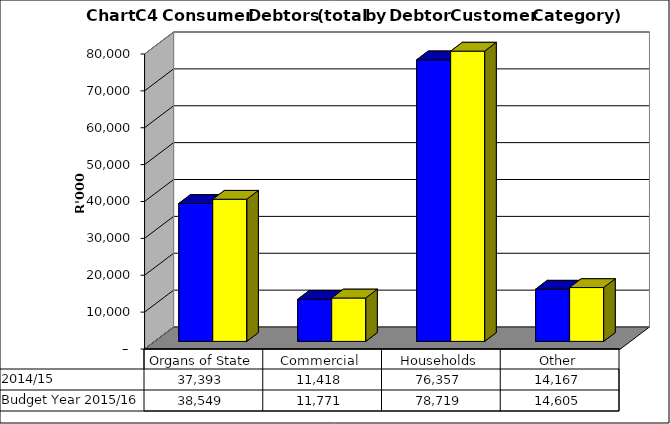
| Category |  2014/15  | Budget Year 2015/16 |
|---|---|---|
| Organs of State | 37392746.31 | 38549223 |
| Commercial | 11417509.16 | 11770628 |
| Households | 76357037.15 | 78718595 |
| Other | 14166571.61 | 14604713 |